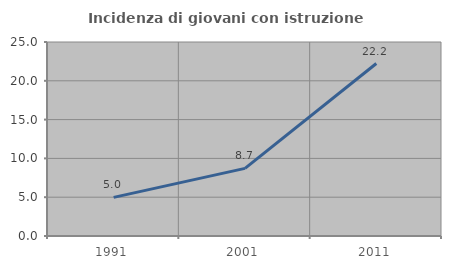
| Category | Incidenza di giovani con istruzione universitaria |
|---|---|
| 1991.0 | 4.978 |
| 2001.0 | 8.712 |
| 2011.0 | 22.229 |